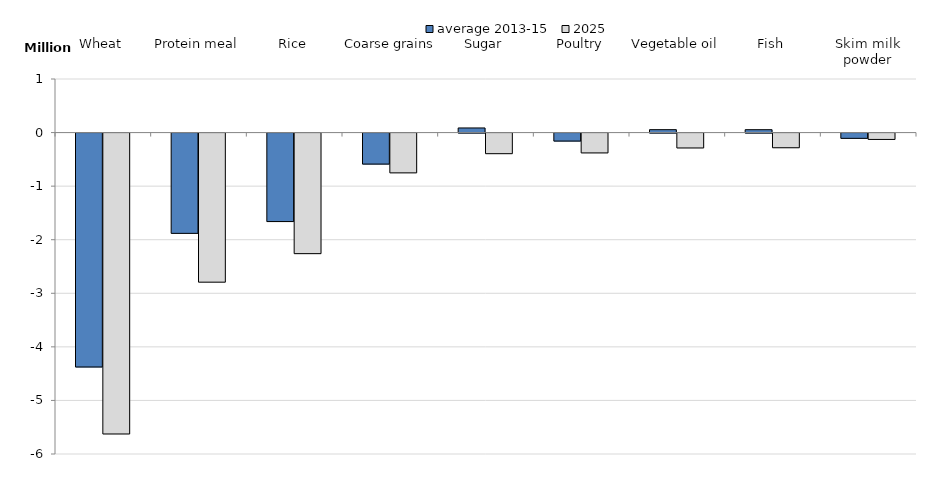
| Category | average 2013-15 | 2025 |
|---|---|---|
| Wheat | -4.367 | -5.617 |
| Protein meal | -1.872 | -2.783 |
| Rice | -1.652 | -2.25 |
| Coarse grains | -0.579 | -0.743 |
| Sugar | 0.086 | -0.385 |
| Poultry | -0.149 | -0.37 |
| Vegetable oil | 0.054 | -0.278 |
| Fish | 0.054 | -0.274 |
| Skim milk powder | -0.099 | -0.119 |